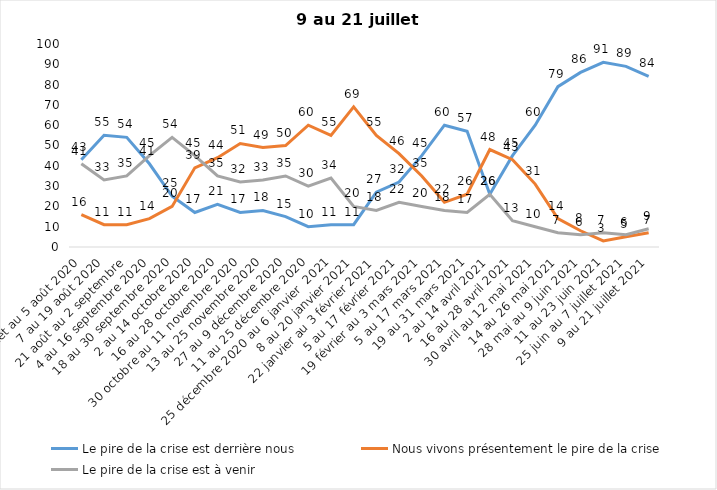
| Category | Le pire de la crise est derrière nous | Nous vivons présentement le pire de la crise | Le pire de la crise est à venir |
|---|---|---|---|
| 24 juillet au 5 août 2020 | 43 | 16 | 41 |
| 7 au 19 août 2020 | 55 | 11 | 33 |
| 21 août au 2 septembre | 54 | 11 | 35 |
| 4 au 16 septembre 2020 | 41 | 14 | 45 |
| 18 au 30 septembre 2020 | 25 | 20 | 54 |
| 2 au 14 octobre 2020 | 17 | 39 | 45 |
| 16 au 28 octobre 2020 | 21 | 44 | 35 |
| 30 octobre au 11 novembre 2020 | 17 | 51 | 32 |
| 13 au 25 novembre 2020 | 18 | 49 | 33 |
| 27 au 9 décembre 2020 | 15 | 50 | 35 |
| 11 au 25 décembre 2020 | 10 | 60 | 30 |
| 25 décembre 2020 au 6 janvier  2021 | 11 | 55 | 34 |
| 8 au 20 janvier 2021 | 11 | 69 | 20 |
| 22 janvier au 3 février 2021 | 27 | 55 | 18 |
| 5 au 17 février 2021 | 32 | 46 | 22 |
| 19 février au 3 mars 2021 | 45 | 35 | 20 |
| 5 au 17 mars 2021 | 60 | 22 | 18 |
| 19 au 31 mars 2021 | 57 | 26 | 17 |
| 2 au 14 avril 2021 | 26 | 48 | 26 |
| 16 au 28 avril 2021 | 45 | 43 | 13 |
| 30 avril au 12 mai 2021 | 60 | 31 | 10 |
| 14 au 26 mai 2021 | 79 | 14 | 7 |
| 28 mai au 9 juin 2021 | 86 | 8 | 6 |
| 11 au 23 juin 2021 | 91 | 3 | 7 |
| 25 juin au 7 juillet 2021 | 89 | 5 | 6 |
| 9 au 21 juillet 2021 | 84 | 7 | 9 |